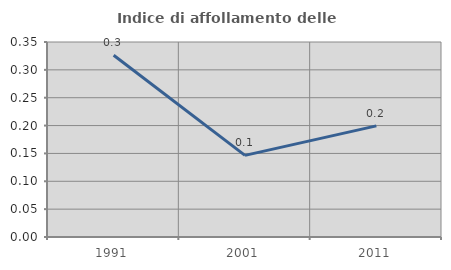
| Category | Indice di affollamento delle abitazioni  |
|---|---|
| 1991.0 | 0.326 |
| 2001.0 | 0.147 |
| 2011.0 | 0.199 |